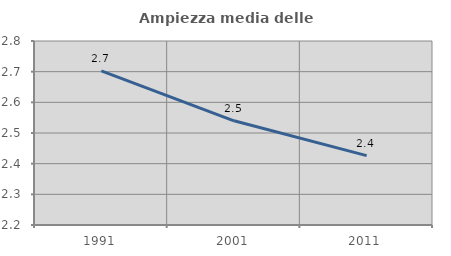
| Category | Ampiezza media delle famiglie |
|---|---|
| 1991.0 | 2.703 |
| 2001.0 | 2.54 |
| 2011.0 | 2.426 |